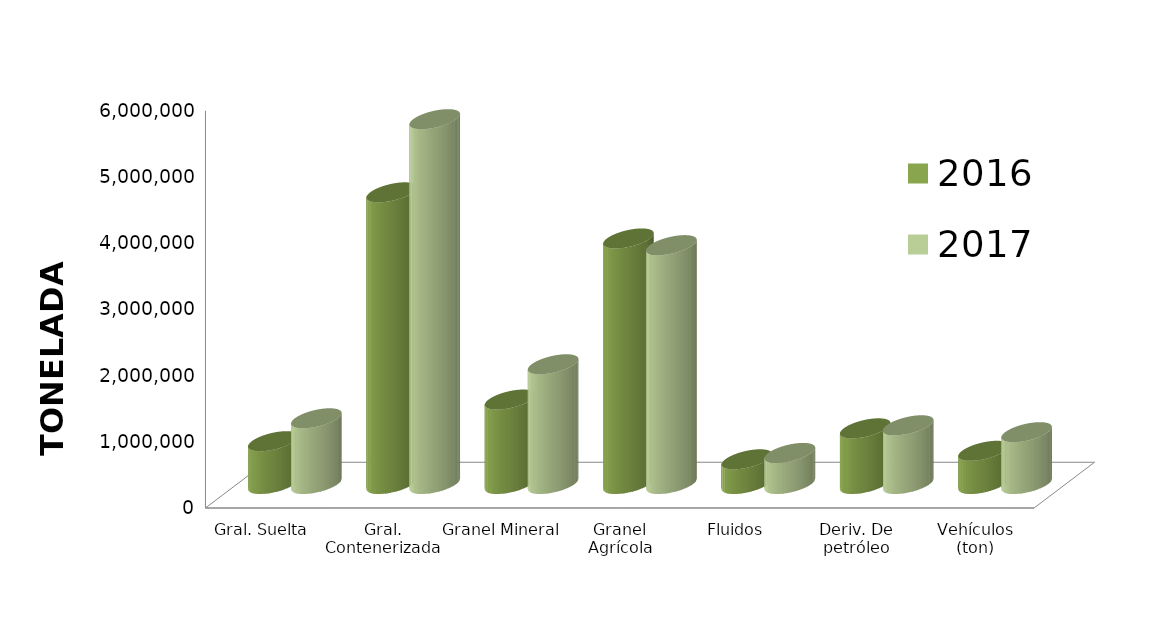
| Category | 2016 | 2017 |
|---|---|---|
| Gral. Suelta | 646780.099 | 992541.787 |
| Gral. Contenerizada | 4405040.983 | 5509890.107 |
| Granel Mineral | 1275419.598 | 1808214.915 |
| Granel Agrícola | 3708394.892 | 3607481.238 |
| Fluidos | 373129.271 | 468860.978 |
| Deriv. De petróleo | 840795.799 | 887127.748 |
| Vehículos (ton) | 501410.418 | 782688.32 |